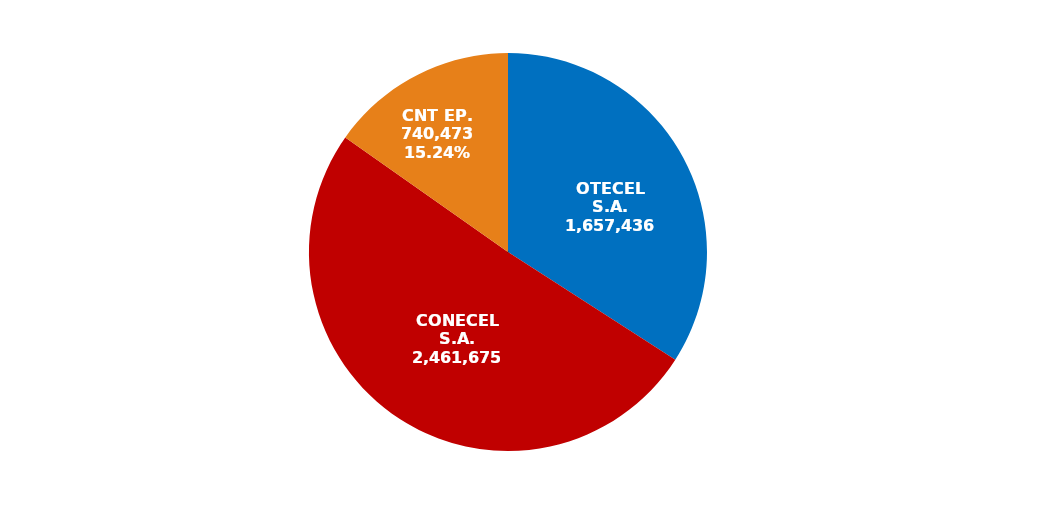
| Category | Series 0 |
|---|---|
| OTECEL S.A. | 1657436 |
| CONECEL S.A. | 2461675 |
| CNT EP. | 740473 |